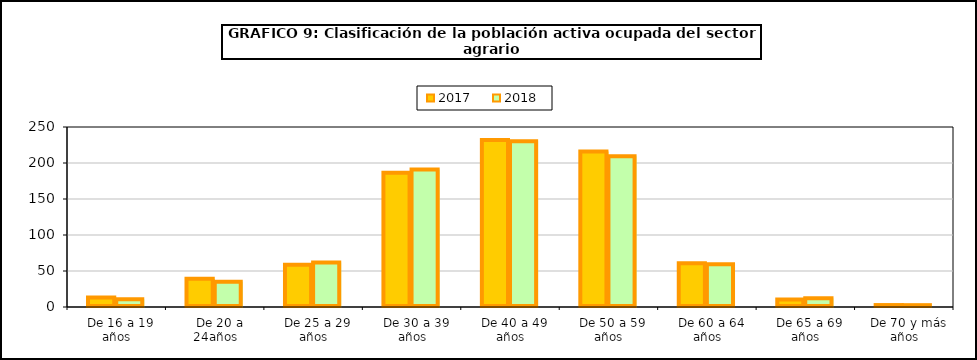
| Category | 2017 | 2018 |
|---|---|---|
|   De 16 a 19 años | 13.075 | 10.725 |
|   De 20 a 24años | 39.075 | 35.2 |
|   De 25 a 29 años | 58.775 | 61.975 |
|   De 30 a 39 años | 186.625 | 191.075 |
|   De 40 a 49 años | 231.975 | 230.2 |
|   De 50 a 59 años | 215.85 | 209.275 |
|   De 60 a 64 años | 60.925 | 59.5 |
|   De 65 a 69 años | 10.5 | 12.1 |
|   De 70 y más años | 2.7 | 2.55 |